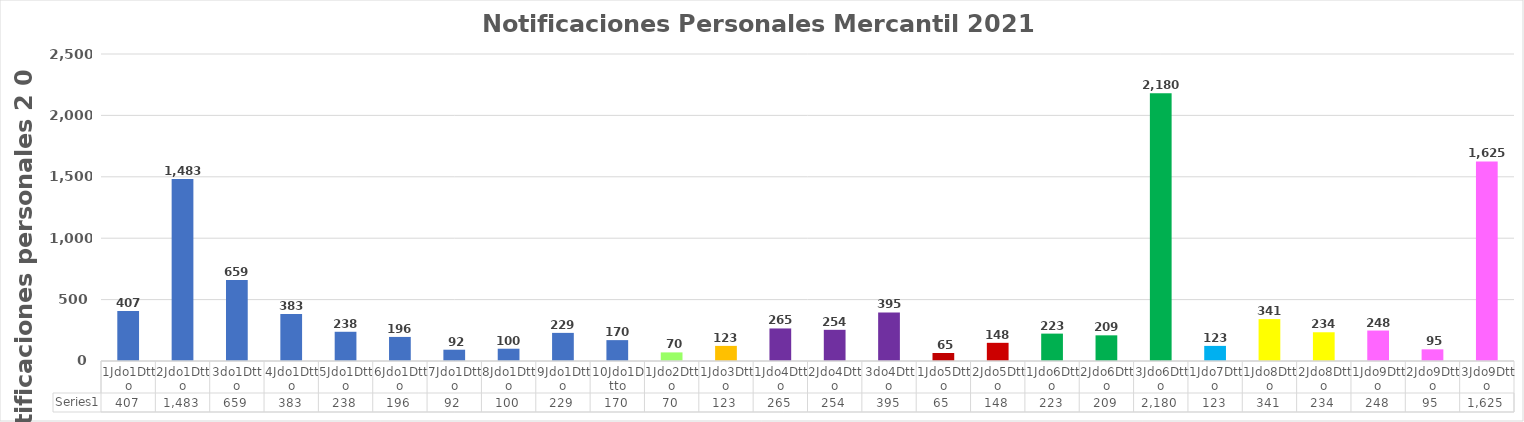
| Category | Series 0 |
|---|---|
| 1Jdo1Dtto | 407 |
| 2Jdo1Dtto | 1483 |
| 3do1Dtto | 659 |
| 4Jdo1Dtto | 383 |
| 5Jdo1Dtto | 238 |
| 6Jdo1Dtto | 196 |
| 7Jdo1Dtto | 92 |
| 8Jdo1Dtto | 100 |
| 9Jdo1Dtto | 229 |
| 10Jdo1Dtto | 170 |
| 1Jdo2Dtto | 70 |
| 1Jdo3Dtto | 123 |
| 1Jdo4Dtto | 265 |
| 2Jdo4Dtto | 254 |
| 3do4Dtto | 395 |
| 1Jdo5Dtto | 65 |
| 2Jdo5Dtto | 148 |
| 1Jdo6Dtto | 223 |
| 2Jdo6Dtto | 209 |
| 3Jdo6Dtto | 2180 |
| 1Jdo7Dtto | 123 |
| 1Jdo8Dtto | 341 |
| 2Jdo8Dtto | 234 |
| 1Jdo9Dtto | 248 |
| 2Jdo9Dtto | 95 |
| 3Jdo9Dtto | 1625 |